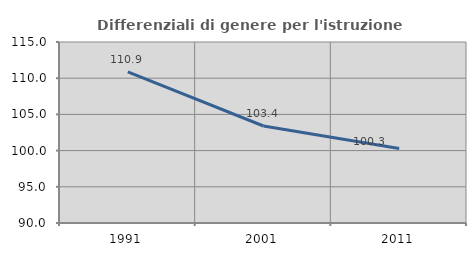
| Category | Differenziali di genere per l'istruzione superiore |
|---|---|
| 1991.0 | 110.881 |
| 2001.0 | 103.396 |
| 2011.0 | 100.29 |